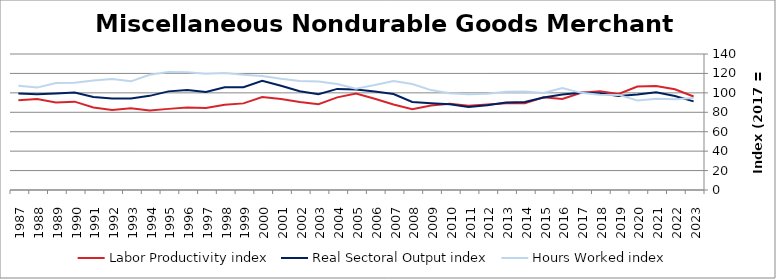
| Category | Labor Productivity index | Real Sectoral Output index | Hours Worked index |
|---|---|---|---|
| 2023.0 | 96.221 | 91.243 | 94.826 |
| 2022.0 | 103.648 | 96.79 | 93.383 |
| 2021.0 | 107.048 | 100.639 | 94.013 |
| 2020.0 | 106.496 | 98.225 | 92.233 |
| 2019.0 | 98.769 | 96.715 | 97.92 |
| 2018.0 | 101.631 | 99.57 | 97.972 |
| 2017.0 | 100 | 100 | 100 |
| 2016.0 | 93.65 | 98.308 | 104.973 |
| 2015.0 | 95.463 | 95.288 | 99.816 |
| 2014.0 | 89.197 | 90.499 | 101.461 |
| 2013.0 | 89.197 | 90.157 | 101.076 |
| 2012.0 | 88.104 | 87.255 | 99.036 |
| 2011.0 | 86.737 | 85.511 | 98.587 |
| 2010.0 | 88.768 | 88.387 | 99.571 |
| 2009.0 | 86.929 | 89.416 | 102.861 |
| 2008.0 | 83.142 | 90.674 | 109.058 |
| 2007.0 | 88.071 | 98.799 | 112.181 |
| 2006.0 | 93.893 | 101.413 | 108.009 |
| 2005.0 | 99.193 | 103.485 | 104.326 |
| 2004.0 | 95.365 | 104.075 | 109.133 |
| 2003.0 | 88.293 | 98.607 | 111.682 |
| 2002.0 | 90.6 | 101.751 | 112.308 |
| 2001.0 | 93.685 | 107.245 | 114.474 |
| 2000.0 | 95.774 | 112.322 | 117.277 |
| 1999.0 | 89.169 | 105.877 | 118.738 |
| 1998.0 | 87.823 | 105.679 | 120.331 |
| 1997.0 | 84.362 | 100.911 | 119.616 |
| 1996.0 | 84.89 | 102.952 | 121.277 |
| 1995.0 | 83.512 | 101.523 | 121.567 |
| 1994.0 | 81.744 | 96.921 | 118.567 |
| 1993.0 | 84.121 | 94.096 | 111.858 |
| 1992.0 | 82.413 | 94.082 | 114.159 |
| 1991.0 | 84.903 | 95.805 | 112.841 |
| 1990.0 | 90.938 | 100.449 | 110.46 |
| 1989.0 | 90.2 | 99.372 | 110.169 |
| 1988.0 | 93.585 | 98.642 | 105.404 |
| 1987.0 | 92.452 | 99.257 | 107.36 |